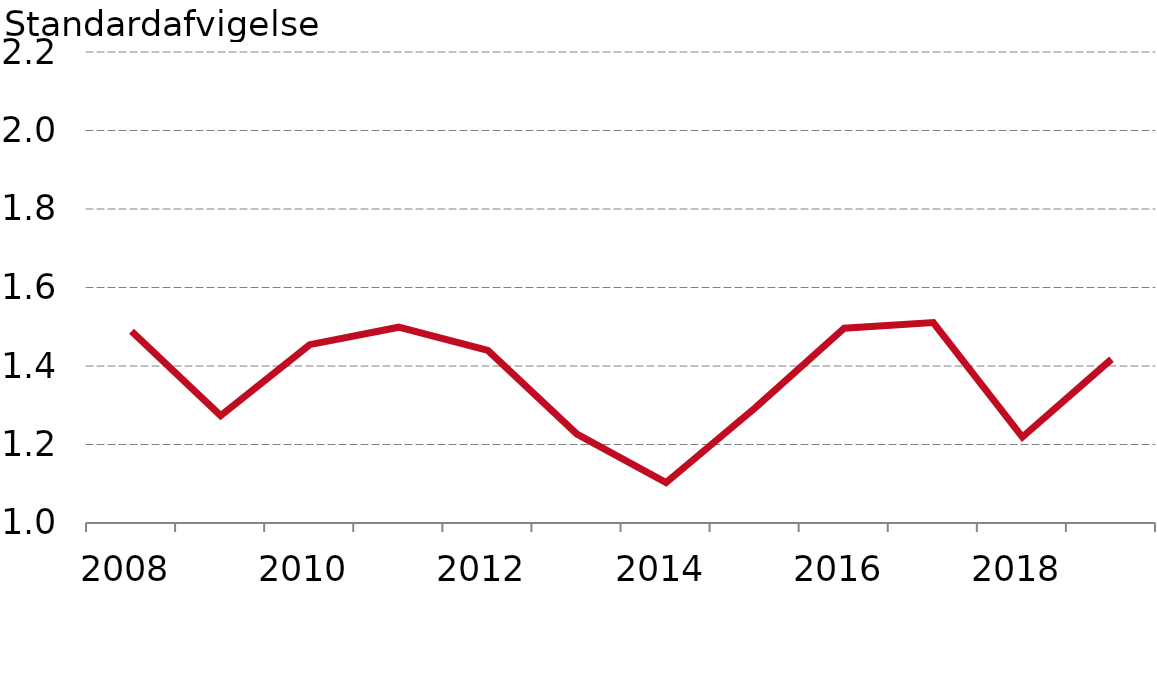
| Category |  Standardafvigelse |
|---|---|
| 2008.0 | 1.489 |
| 2009.0 | 1.274 |
| 2010.0 | 1.454 |
| 2011.0 | 1.499 |
| 2012.0 | 1.44 |
| 2013.0 | 1.227 |
| 2014.0 | 1.103 |
| 2015.0 | 1.293 |
| 2016.0 | 1.496 |
| 2017.0 | 1.511 |
| 2018.0 | 1.219 |
| 2019.0 | 1.417 |